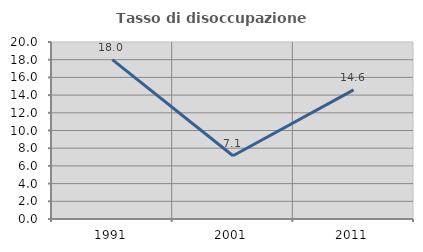
| Category | Tasso di disoccupazione giovanile  |
|---|---|
| 1991.0 | 18 |
| 2001.0 | 7.143 |
| 2011.0 | 14.583 |